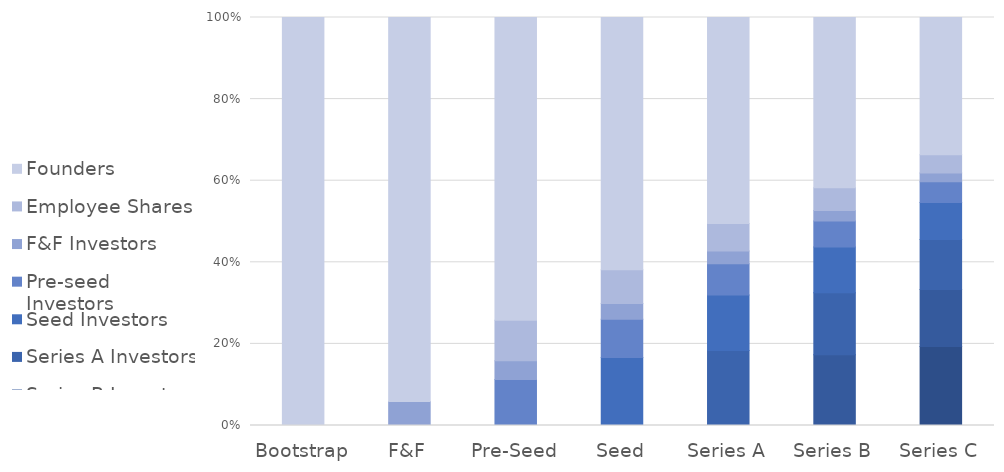
| Category | Series C Investors | Series B Investors | Series A Investors | Seed Investors | Pre-seed Investors | F&F Investors | Employee Shares | Founders |
|---|---|---|---|---|---|---|---|---|
| Bootstrap | 0 | 0 | 0 | 0 | 0 | 0 | 0 | 1 |
| F&F | 0 | 0 | 0 | 0 | 0 | 0.059 | 0 | 0.941 |
| Pre-Seed | 0 | 0 | 0 | 0 | 0.113 | 0.046 | 0.099 | 0.742 |
| Seed | 0 | 0 | 0 | 0.167 | 0.094 | 0.039 | 0.083 | 0.618 |
| Series A | 0 | 0 | 0.184 | 0.136 | 0.077 | 0.032 | 0.067 | 0.505 |
| Series B | 0 | 0.174 | 0.152 | 0.112 | 0.063 | 0.026 | 0.056 | 0.417 |
| Series C | 0.194 | 0.14 | 0.122 | 0.091 | 0.051 | 0.021 | 0.045 | 0.336 |